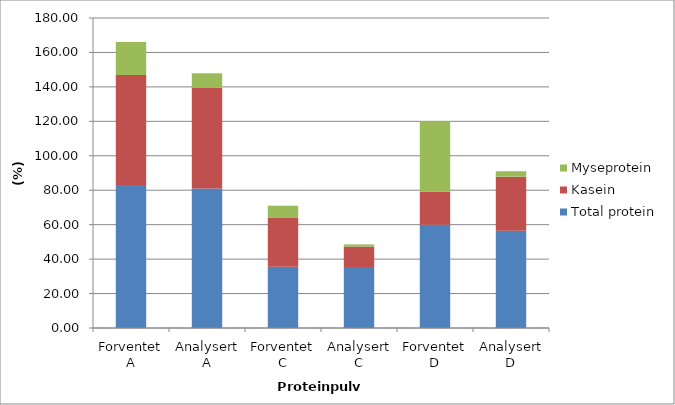
| Category | Total protein | Kasein | Myseprotein |
|---|---|---|---|
| Forventet A | 83 | 63.91 | 19.09 |
| Analysert A | 80.945 | 58.491 | 8.459 |
| Forventet C | 35.5 | 28.4 | 7.1 |
| Analysert C | 35.382 | 11.896 | 1.271 |
| Forventet D | 60 | 19.2 | 40.8 |
| Analysert D | 56.505 | 31.346 | 3.177 |